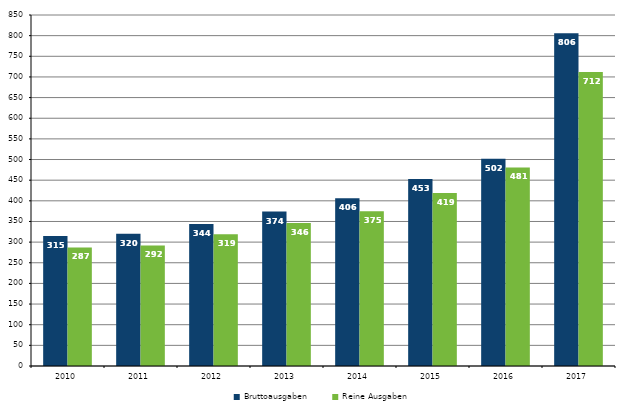
| Category | Bruttoausgaben | Reine Ausgaben |
|---|---|---|
| 2010.0 | 315 | 287 |
| 2011.0 | 320 | 292 |
| 2012.0 | 344 | 319 |
| 2013.0 | 374 | 346 |
| 2014.0 | 406 | 375 |
| 2015.0 | 453 | 419 |
| 2016.0 | 502 | 481 |
| 2017.0 | 806 | 712 |